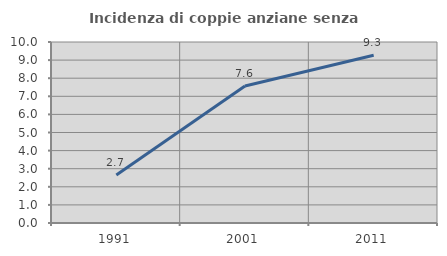
| Category | Incidenza di coppie anziane senza figli  |
|---|---|
| 1991.0 | 2.655 |
| 2001.0 | 7.573 |
| 2011.0 | 9.265 |